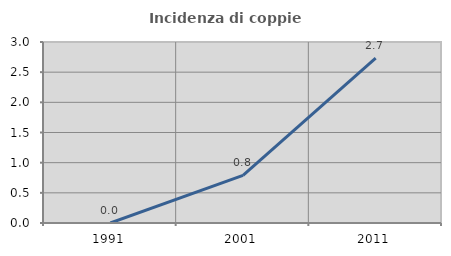
| Category | Incidenza di coppie miste |
|---|---|
| 1991.0 | 0 |
| 2001.0 | 0.79 |
| 2011.0 | 2.731 |